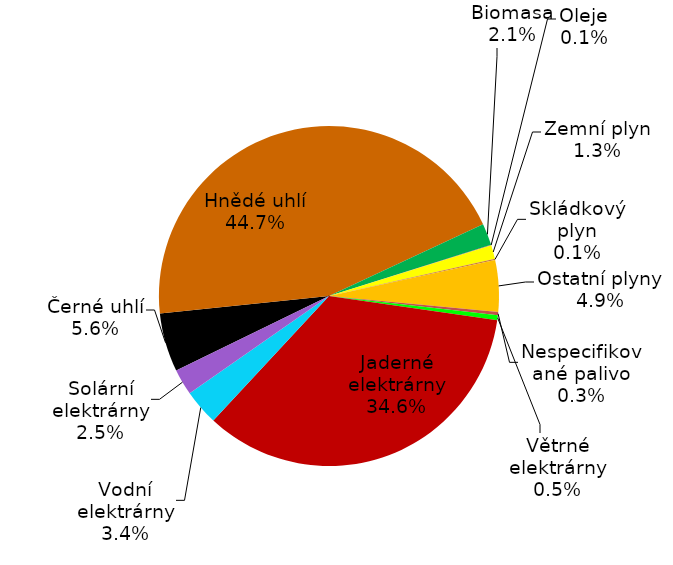
| Category | Series 0 |
|---|---|
| Černé uhlí | 4887 |
| Hnědé uhlí | 39143 |
| Biomasa | 1813 |
| Oleje | 48 |
| Zemní plyn | 1141 |
| Skládkový plyn | 102 |
| Ostatní plyny | 4294 |
| Nespecifikované palivo | 264 |
| Větrné elektrárny | 417 |
| Jaderné elektrárny | 30324 |
| Vodní elektrárny | 2963 |
| Solární elektrárny | 2173 |